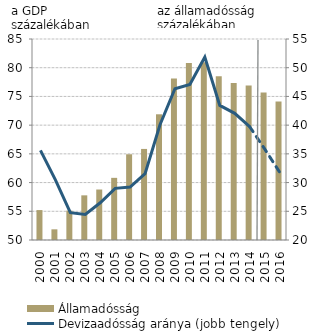
| Category | Államadósság |
|---|---|
| 2000.0 | 55.21 |
| 2001.0 | 51.858 |
| 2002.0 | 55.113 |
| 2003.0 | 57.777 |
| 2004.0 | 58.792 |
| 2005.0 | 60.823 |
| 2006.0 | 64.928 |
| 2007.0 | 65.858 |
| 2008.0 | 71.891 |
| 2009.0 | 78.127 |
| 2010.0 | 80.838 |
| 2011.0 | 80.963 |
| 2012.0 | 78.492 |
| 2013.0 | 77.336 |
| 2014.0 | 76.892 |
| 2015.0 | 75.705 |
| 2016.0 | 74.119 |